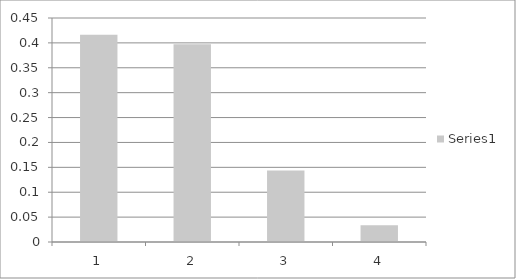
| Category | Series 0 |
|---|---|
| 0 | 0.416 |
| 1 | 0.397 |
| 2 | 0.143 |
| 3 | 0.034 |